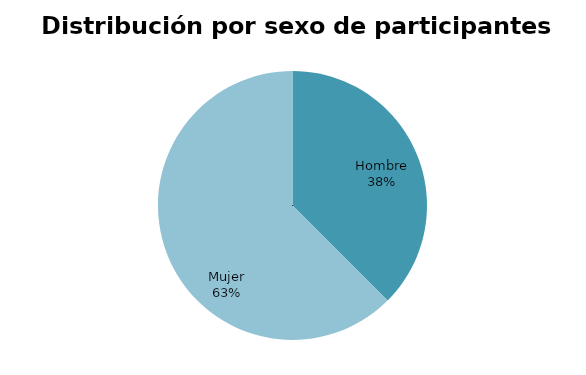
| Category | Series 0 |
|---|---|
| Hombre | 3 |
| Mujer | 5 |